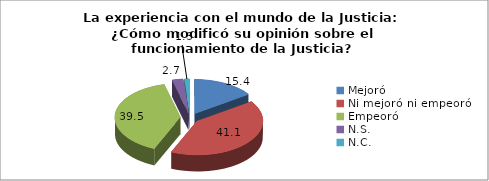
| Category | % |
|---|---|
| Mejoró | 15.4 |
| Ni mejoró ni empeoró  | 41.1 |
| Empeoró | 39.5 |
| N.S.  | 2.7 |
| N.C.  | 1.3 |